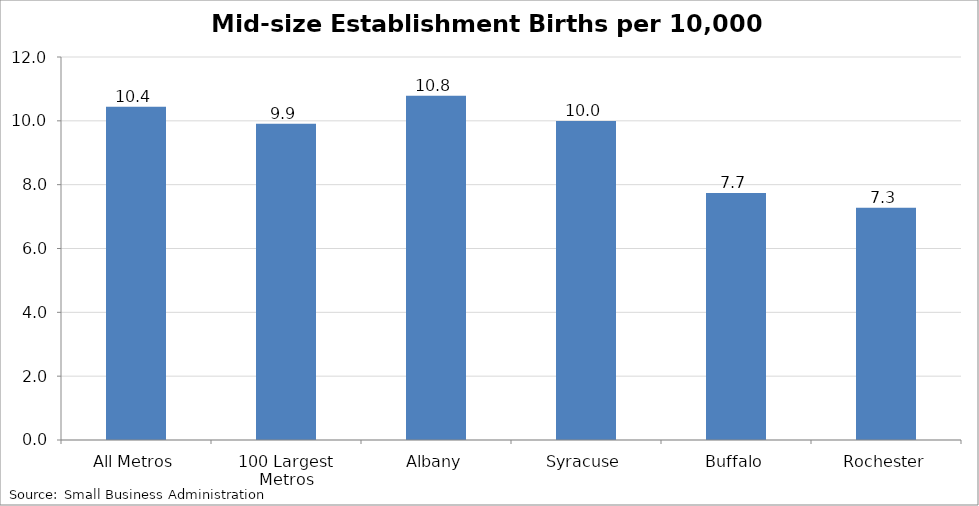
| Category | Mid-size Establishment Births per 10,000 Employees |
|---|---|
| All Metros | 10.442 |
| 100 Largest Metros | 9.911 |
| Albany | 10.782 |
| Syracuse | 9.996 |
| Buffalo | 7.74 |
| Rochester | 7.273 |